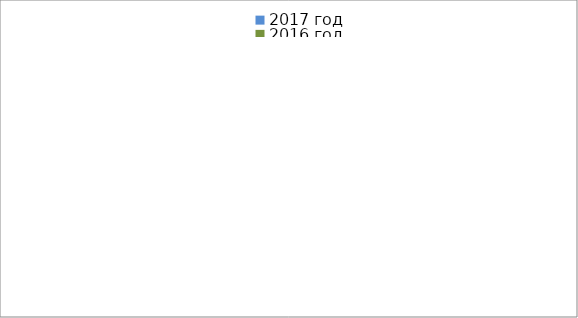
| Category | 2017 год | 2016 год |
|---|---|---|
|  - поджог | 11 | 29 |
|  - неосторожное обращение с огнём | 4 | 19 |
|  - НПТЭ электрооборудования | 14 | 12 |
|  - НПУ и Э печей | 30 | 28 |
|  - НПУ и Э транспортных средств | 38 | 18 |
|   -Шалость с огнем детей | 3 | 5 |
|  -НППБ при эксплуатации эл.приборов | 21 | 6 |
|  - курение | 24 | 12 |
| - прочие | 54 | 62 |
| - не установленные причины | 0 | 11 |